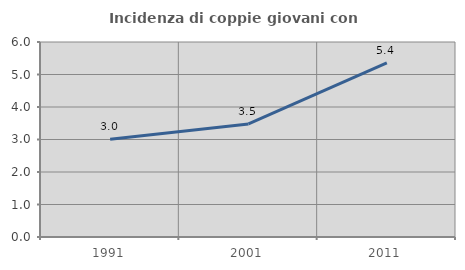
| Category | Incidenza di coppie giovani con figli |
|---|---|
| 1991.0 | 3.008 |
| 2001.0 | 3.478 |
| 2011.0 | 5.357 |